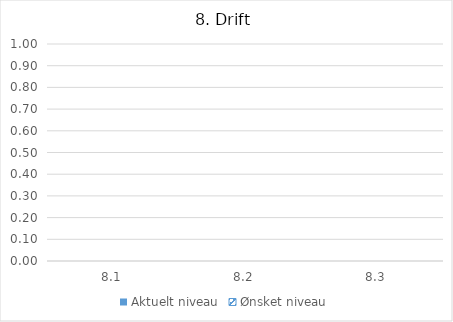
| Category | Aktuelt niveau | Ønsket niveau |
|---|---|---|
| 8.1 | 0 | 0 |
| 8.2 | 0 | 0 |
| 8.3 | 0 | 0 |